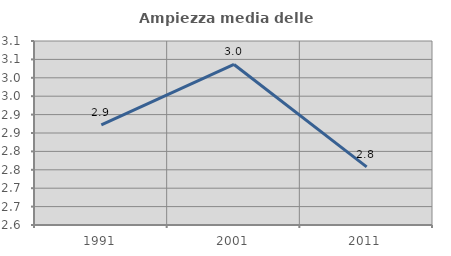
| Category | Ampiezza media delle famiglie |
|---|---|
| 1991.0 | 2.872 |
| 2001.0 | 3.036 |
| 2011.0 | 2.758 |